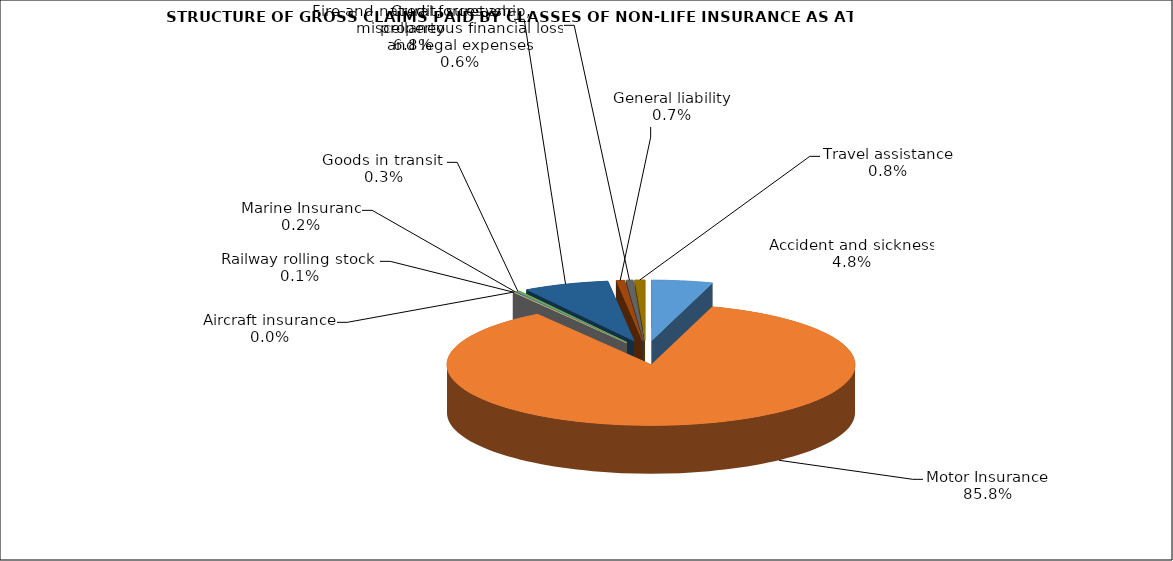
| Category | Accident and sickness | Series 1 |
|---|---|---|
| Accident and sickness | 0.048 |  |
| Motor Insurance | 0.858 |  |
| Railway rolling stock  | 0.001 |  |
| Aircraft insurance | 0 |  |
| Marine Insuranc | 0.002 |  |
| Goods in transit  | 0.003 |  |
| Fire and natural forces and property | 0.068 |  |
| General liability | 0.007 |  |
| Credit, suretyship, miscellaneous financial loss and legal expenses | 0.006 |  |
| Travel assistance | 0.008 |  |